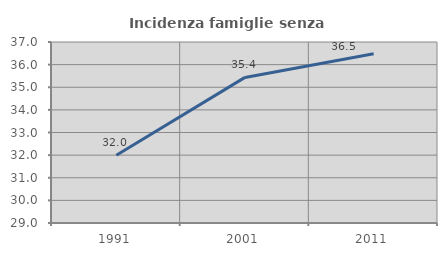
| Category | Incidenza famiglie senza nuclei |
|---|---|
| 1991.0 | 31.991 |
| 2001.0 | 35.435 |
| 2011.0 | 36.482 |